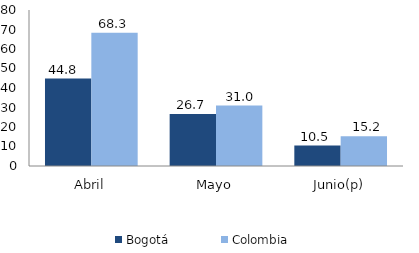
| Category | Bogotá | Colombia |
|---|---|---|
| Abril | 44.808 | 68.305 |
| Mayo | 26.711 | 30.993 |
| Junio(p) | 10.455 | 15.201 |